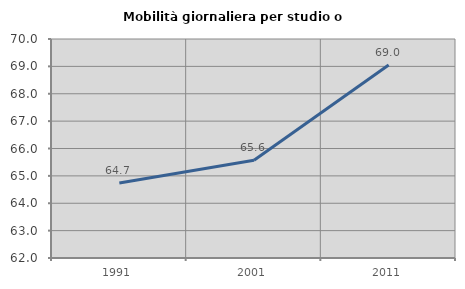
| Category | Mobilità giornaliera per studio o lavoro |
|---|---|
| 1991.0 | 64.738 |
| 2001.0 | 65.569 |
| 2011.0 | 69.047 |